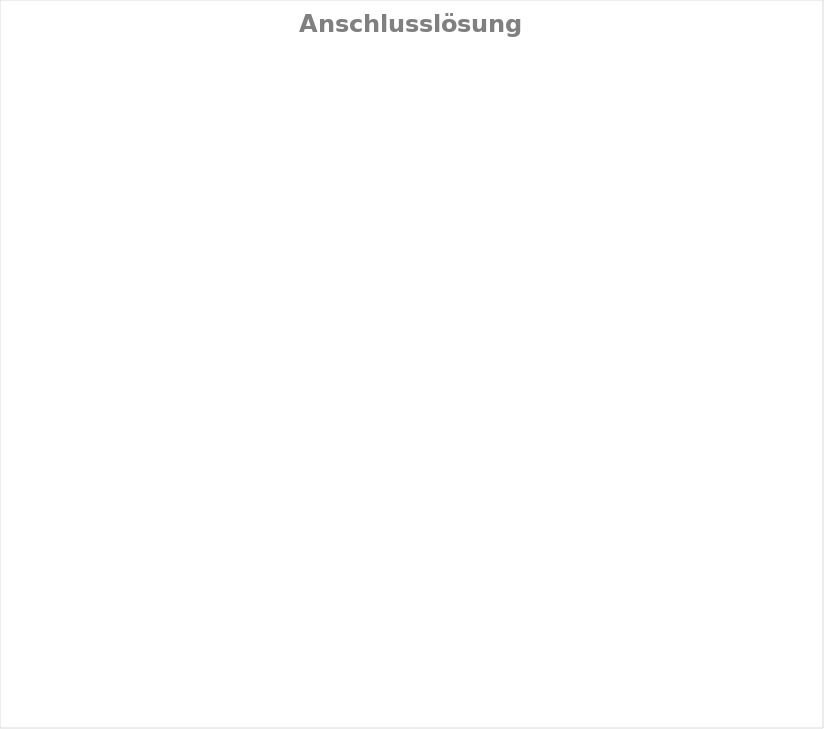
| Category | Series 0 |
|---|---|
| 1. Arbeitsmarkt (orts- und branchenüblicher Lohn) | 0 |
| 1. Arbeitsmarkt (reduzierter Lohn) | 0 |
| Arbeitsversuch, Praktika | 0 |
| weitere IM / BM extern | 0 |
| Andere | 0 |
| Keine Anschlusslösung | 0 |